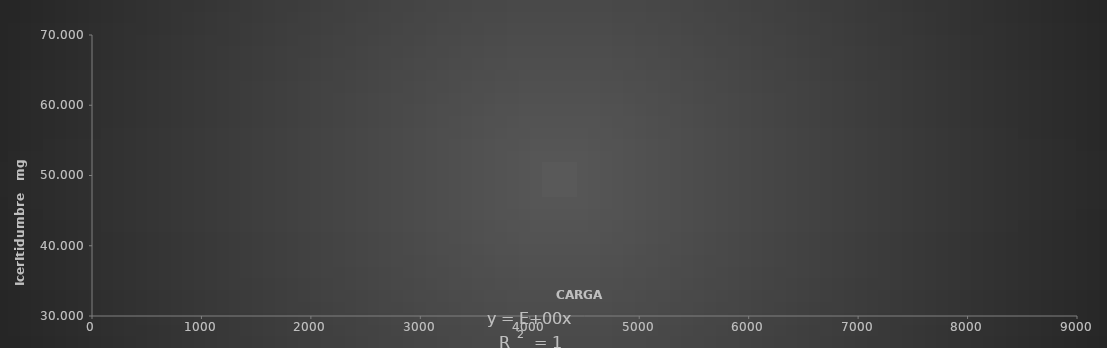
| Category | 5 |
|---|---|
| 5.0 | 0 |
| 1000.0 | 0 |
| 2000.0 | 0 |
| 5000.0 | 0 |
| 8200.0 | 0 |